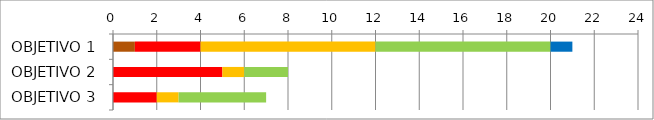
| Category | Series 0 | Series 1 | Series 2 | Series 3 | Series 4 | Series 5 |
|---|---|---|---|---|---|---|
| OBJETIVO 1 | 1 | 0 | 3 | 8 | 8 | 1 |
| OBJETIVO 2 | 0 | 0 | 5 | 1 | 2 | 0 |
| OBJETIVO 3 | 0 | 0 | 2 | 1 | 4 | 0 |